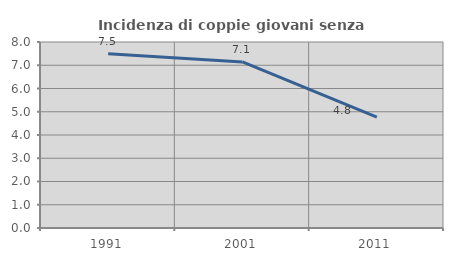
| Category | Incidenza di coppie giovani senza figli |
|---|---|
| 1991.0 | 7.497 |
| 2001.0 | 7.143 |
| 2011.0 | 4.766 |